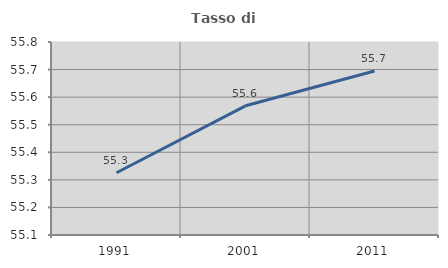
| Category | Tasso di occupazione   |
|---|---|
| 1991.0 | 55.326 |
| 2001.0 | 55.569 |
| 2011.0 | 55.695 |